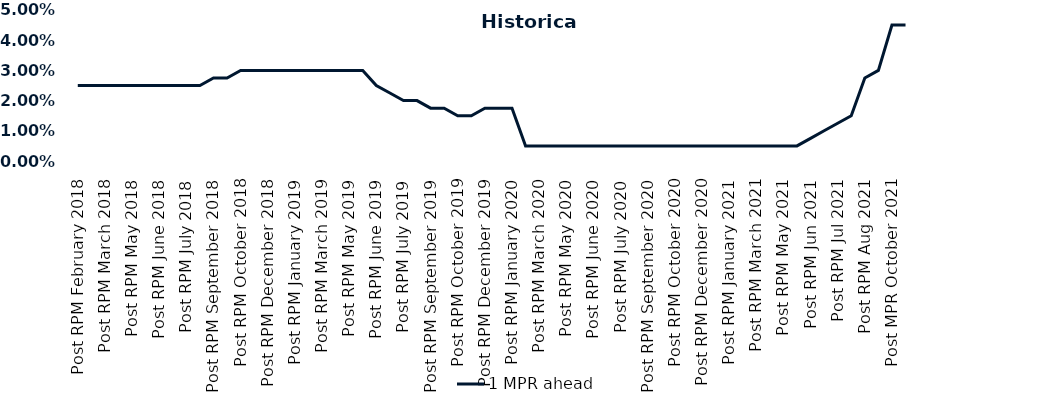
| Category | 1 MPR ahead |
|---|---|
| Post RPM February 2018 | 0.025 |
| Pre RPM March 2018 | 0.025 |
| Post RPM March 2018 | 0.025 |
| Pre RPM May 2018 | 0.025 |
| Post RPM May 2018 | 0.025 |
| Pre RPM June 2018 | 0.025 |
| Post RPM June 2018 | 0.025 |
| Pre RPM July 2018 | 0.025 |
| Post RPM July 2018 | 0.025 |
| Pre RPM September 2018 | 0.025 |
| Post RPM September 2018 | 0.028 |
| Pre RPM October 2018 | 0.028 |
| Post RPM October 2018 | 0.03 |
| Pre RPM December 2018 | 0.03 |
| Post RPM December 2018 | 0.03 |
| Pre RPM January 2019 | 0.03 |
| Post RPM January 2019 | 0.03 |
| Pre RPM March 2019 | 0.03 |
| Post RPM March 2019 | 0.03 |
| Pre RPM May 2019 | 0.03 |
| Post RPM May 2019 | 0.03 |
| Pre RPM June 2019 | 0.03 |
| Post RPM June 2019 | 0.025 |
| Pre RPM July 2019 | 0.022 |
| Post RPM July 2019 | 0.02 |
| Pre RPM September 2019 | 0.02 |
| Post RPM September 2019 | 0.018 |
| Pre RPM October 2019 | 0.018 |
| Post RPM October 2019 | 0.015 |
| Pre RPM December 2019 | 0.015 |
| Post RPM December 2019 | 0.018 |
| Pre RPM January 2020 | 0.018 |
| Post RPM January 2020 | 0.018 |
| Pre RPM March 2020 | 0.005 |
| Post RPM March 2020 | 0.005 |
| Pre RPM May 2020 | 0.005 |
| Post RPM May 2020 | 0.005 |
| Pre RPM June 2020 | 0.005 |
| Post RPM June 2020 | 0.005 |
| Pre RPM July 2020 | 0.005 |
| Post RPM July 2020 | 0.005 |
| Pre RPM September 2020 | 0.005 |
| Post RPM September 2020 | 0.005 |
| Pre RPM October 2020 | 0.005 |
| Post RPM October 2020 | 0.005 |
| Pre RPM December 2020 | 0.005 |
|  Post RPM December 2020 | 0.005 |
| Pre RPM January 2021 | 0.005 |
| Post RPM January 2021 | 0.005 |
|  Pre RPM March 2021 | 0.005 |
|  Post RPM March 2021 | 0.005 |
|  Pre RPM May 2021 | 0.005 |
|  Post RPM May 2021 | 0.005 |
|  Pre RPM Jun 2021 | 0.005 |
|   Post RPM Jun 2021 | 0.008 |
| Pre RPM Jul 2021 | 0.01 |
|  Post RPM Jul 2021 | 0.012 |
| Pre RPM Aug 2021 | 0.015 |
|  Post RPM Aug 2021 | 0.028 |
| Pre MPR October 2021 | 0.03 |
| Post MPR October 2021 | 0.045 |
| Pre MPR December 2021 | 0.045 |